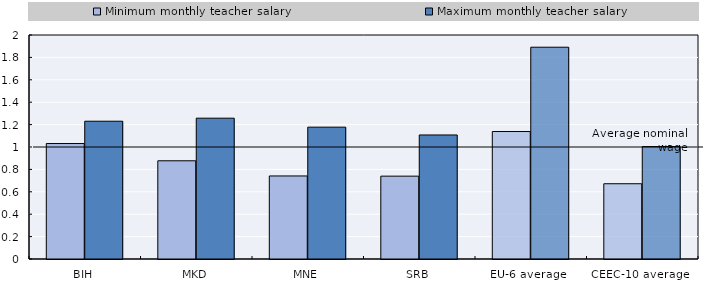
| Category | Minimum monthly teacher salary | Maximum monthly teacher salary |
|---|---|---|
| BIH | 1.031 | 1.23 |
| MKD | 0.877 | 1.257 |
| MNE | 0.741 | 1.177 |
| SRB | 0.74 | 1.108 |
| EU-6 average | 1.138 | 1.891 |
| CEEC-10 average | 0.672 | 1.004 |